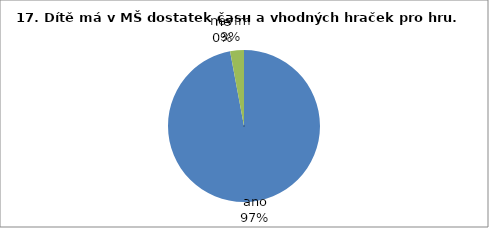
| Category | 17. |
|---|---|
| ano | 33 |
| ne | 0 |
| nevím | 1 |